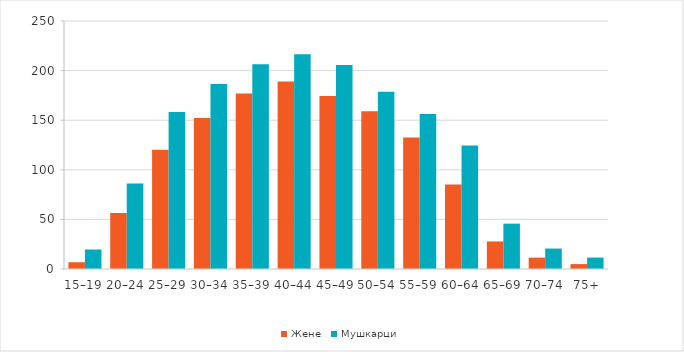
| Category | Жене | Мушкарци |
|---|---|---|
| 15–19 | 6.8 | 19.652 |
| 20–24 | 56.528 | 86.112 |
| 25–29 | 120.337 | 158.341 |
| 30–34 | 152.271 | 186.457 |
| 35–39 | 176.802 | 206.303 |
| 40–44 | 188.902 | 216.606 |
| 45–49 | 174.376 | 205.763 |
| 50–54 | 158.911 | 178.561 |
| 55–59 | 132.633 | 156.209 |
| 60–64 | 85.254 | 124.607 |
| 65–69 | 27.799 | 45.716 |
| 70–74 | 11.465 | 20.605 |
| 75+ | 4.943 | 11.509 |